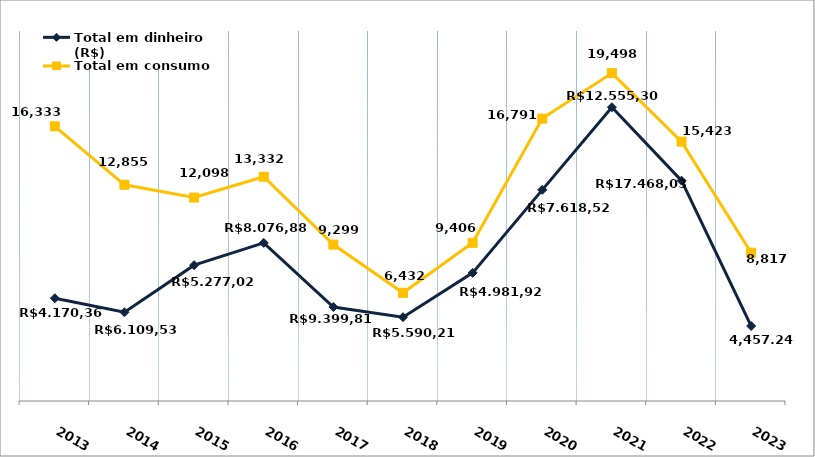
| Category | Total em dinheiro (R$) |
|---|---|
| 2013.0 | 6109.53 |
| 2014.0 | 5277.02 |
| 2015.0 | 8076.88 |
| 2016.0 | 9399.81 |
| 2017.0 | 5590.21 |
| 2018.0 | 4981.92 |
| 2019.0 | 7618.52 |
| 2020.0 | 12555.3 |
| 2021.0 | 17468.03 |
| 2022.0 | 13102.62 |
| 2023.0 | 4457.24 |